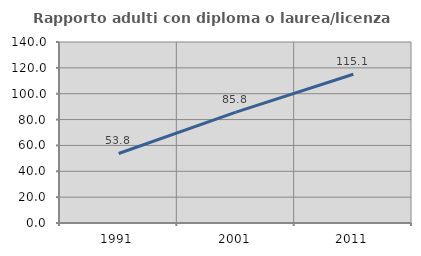
| Category | Rapporto adulti con diploma o laurea/licenza media  |
|---|---|
| 1991.0 | 53.764 |
| 2001.0 | 85.783 |
| 2011.0 | 115.094 |